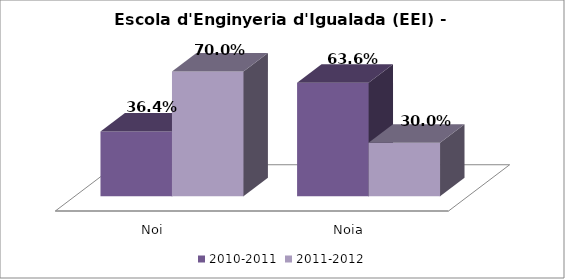
| Category | 2010-2011 | 2011-2012 |
|---|---|---|
| Noi | 0.364 | 0.7 |
| Noia | 0.636 | 0.3 |